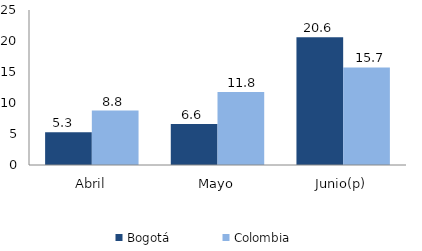
| Category | Bogotá | Colombia |
|---|---|---|
| Abril | 5.263 | 8.771 |
| Mayo | 6.605 | 11.772 |
| Junio(p) | 20.608 | 15.73 |